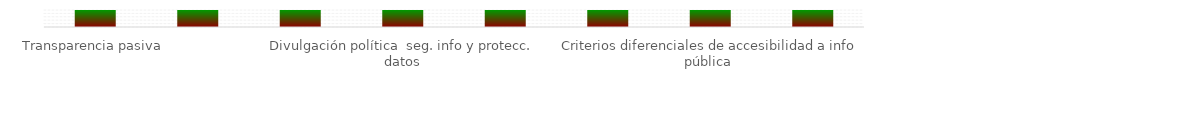
| Category | Niveles |
|---|---|
| Transparencia pasiva | 100 |
| Transparencia activa  | 100 |
| Seguimiento acceso a info pública | 100 |
| Divulgación política  seg. info y protecc. datos | 100 |
| Gestión documental para acceso a Info pública  | 100 |
| Instrumentos gestión de información  | 100 |
| Criterios diferenciales de accesibilidad a info pública  | 100 |
| Conocimientos y criterios sobre transp y acceso a info pública  | 100 |